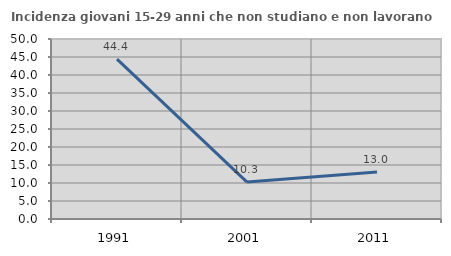
| Category | Incidenza giovani 15-29 anni che non studiano e non lavorano  |
|---|---|
| 1991.0 | 44.398 |
| 2001.0 | 10.26 |
| 2011.0 | 13.026 |